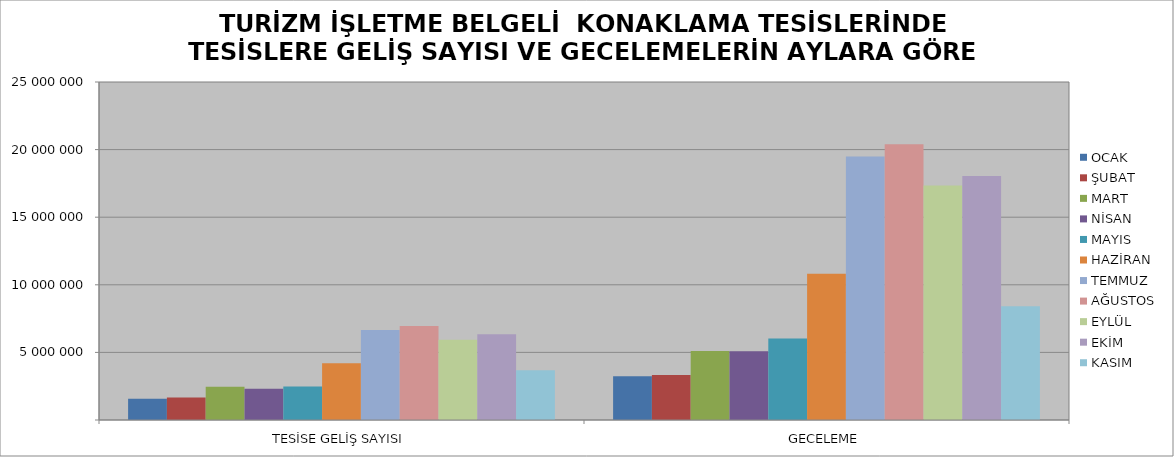
| Category | OCAK | ŞUBAT | MART | NİSAN | MAYIS | HAZİRAN | TEMMUZ | AĞUSTOS | EYLÜL | EKİM | KASIM |
|---|---|---|---|---|---|---|---|---|---|---|---|
| TESİSE GELİŞ SAYISI | 1573897 | 1671849 | 2464804 | 2308180 | 2481677 | 4205401 | 6650448 | 6956989 | 5928120 | 6337656 | 3673544 |
| GECELEME | 3243443 | 3336180 | 5099393 | 5085007 | 6022382 | 10825120 | 19483045 | 20395896 | 17336970 | 18040291 | 8410138 |